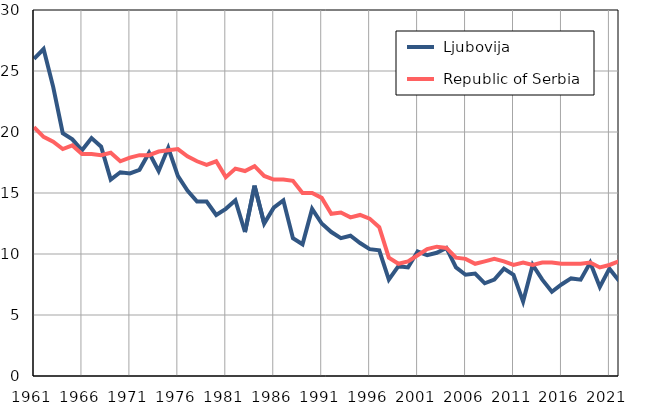
| Category |  Ljubovija |  Republic of Serbia |
|---|---|---|
| 1961.0 | 26 | 20.4 |
| 1962.0 | 26.8 | 19.6 |
| 1963.0 | 23.7 | 19.2 |
| 1964.0 | 19.9 | 18.6 |
| 1965.0 | 19.4 | 18.9 |
| 1966.0 | 18.5 | 18.2 |
| 1967.0 | 19.5 | 18.2 |
| 1968.0 | 18.8 | 18.1 |
| 1969.0 | 16.1 | 18.3 |
| 1970.0 | 16.7 | 17.6 |
| 1971.0 | 16.6 | 17.9 |
| 1972.0 | 16.9 | 18.1 |
| 1973.0 | 18.3 | 18.1 |
| 1974.0 | 16.8 | 18.4 |
| 1975.0 | 18.7 | 18.5 |
| 1976.0 | 16.4 | 18.6 |
| 1977.0 | 15.2 | 18 |
| 1978.0 | 14.3 | 17.6 |
| 1979.0 | 14.3 | 17.3 |
| 1980.0 | 13.2 | 17.6 |
| 1981.0 | 13.7 | 16.3 |
| 1982.0 | 14.4 | 17 |
| 1983.0 | 11.8 | 16.8 |
| 1984.0 | 15.6 | 17.2 |
| 1985.0 | 12.5 | 16.4 |
| 1986.0 | 13.8 | 16.1 |
| 1987.0 | 14.4 | 16.1 |
| 1988.0 | 11.3 | 16 |
| 1989.0 | 10.8 | 15 |
| 1990.0 | 13.7 | 15 |
| 1991.0 | 12.5 | 14.6 |
| 1992.0 | 11.8 | 13.3 |
| 1993.0 | 11.3 | 13.4 |
| 1994.0 | 11.5 | 13 |
| 1995.0 | 10.9 | 13.2 |
| 1996.0 | 10.4 | 12.9 |
| 1997.0 | 10.3 | 12.2 |
| 1998.0 | 7.9 | 9.7 |
| 1999.0 | 9 | 9.2 |
| 2000.0 | 8.9 | 9.4 |
| 2001.0 | 10.2 | 9.9 |
| 2002.0 | 9.9 | 10.4 |
| 2003.0 | 10.1 | 10.6 |
| 2004.0 | 10.5 | 10.5 |
| 2005.0 | 8.9 | 9.7 |
| 2006.0 | 8.3 | 9.6 |
| 2007.0 | 8.4 | 9.2 |
| 2008.0 | 7.6 | 9.4 |
| 2009.0 | 7.9 | 9.6 |
| 2010.0 | 8.8 | 9.4 |
| 2011.0 | 8.3 | 9.1 |
| 2012.0 | 6.1 | 9.3 |
| 2013.0 | 9.1 | 9.1 |
| 2014.0 | 7.9 | 9.3 |
| 2015.0 | 6.9 | 9.3 |
| 2016.0 | 7.5 | 9.2 |
| 2017.0 | 8 | 9.2 |
| 2018.0 | 7.9 | 9.2 |
| 2019.0 | 9.3 | 9.3 |
| 2020.0 | 7.3 | 8.9 |
| 2021.0 | 8.8 | 9.1 |
| 2022.0 | 7.8 | 9.4 |